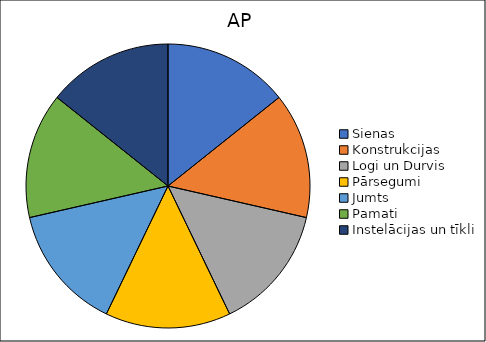
| Category | Sienas  |
|---|---|
| Sienas  | 0.003 |
| Konstrukcijas | 0.003 |
| Logi un Durvis | 0.003 |
| Pārsegumi | 0.003 |
| Jumts | 0.003 |
| Pamati | 0.003 |
| Instelācijas un tīkli | 0.003 |